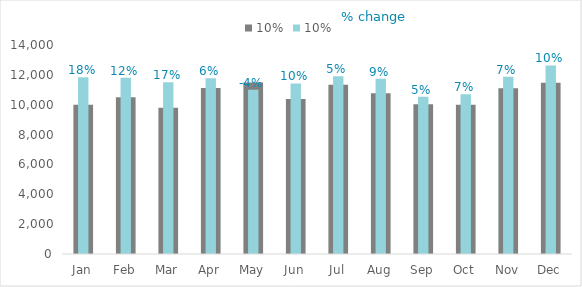
| Category | 2019 |
|---|---|
| Jan | 10000 |
| Feb | 10500 |
| Mar | 9800 |
| Apr | 11112 |
| May | 11493 |
| Jun | 10390 |
| Jul | 11342 |
| Aug | 10764 |
| Sep | 10039 |
| Oct | 10003 |
| Nov | 11095 |
| Dec | 11479 |